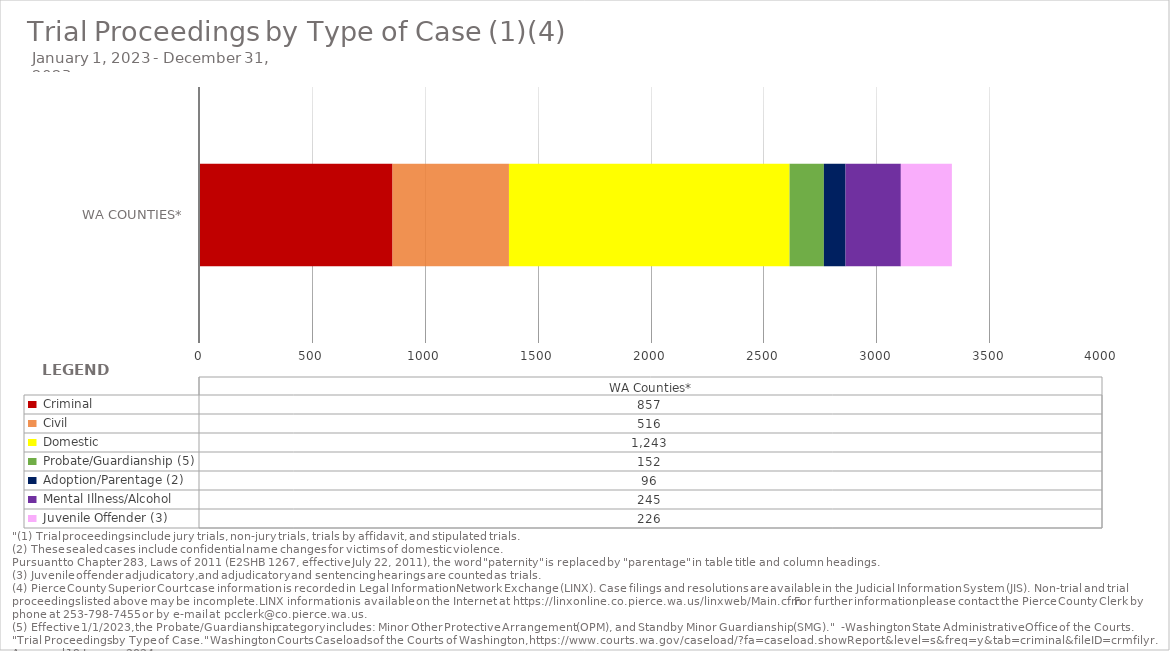
| Category |  Criminal  |  Civil  |  Domestic  |  Probate/Guardianship (5)  |  Adoption/Parentage (2)  |  Mental Illness/Alcohol  |  Juvenile Offender (3)  |
|---|---|---|---|---|---|---|---|
|  WA Counties* | 857 | 516 | 1243 | 152 | 96 | 245 | 226 |